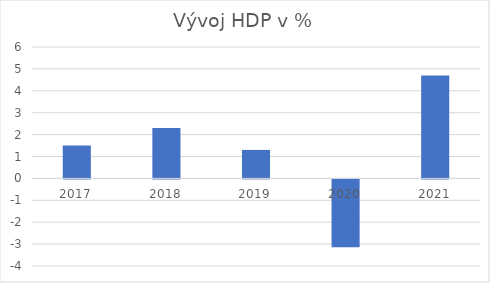
| Category | Vývoj HDP v % |
|---|---|
| 2017.0 | 1.5 |
| 2018.0 | 2.3 |
| 2019.0 | 1.3 |
| 2020.0 | -3.1 |
| 2021.0 | 4.7 |